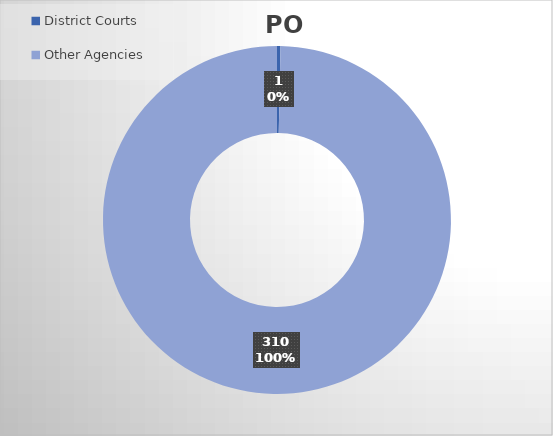
| Category | PO Lines |
|---|---|
| District Courts | 1 |
| Other Agencies | 310 |